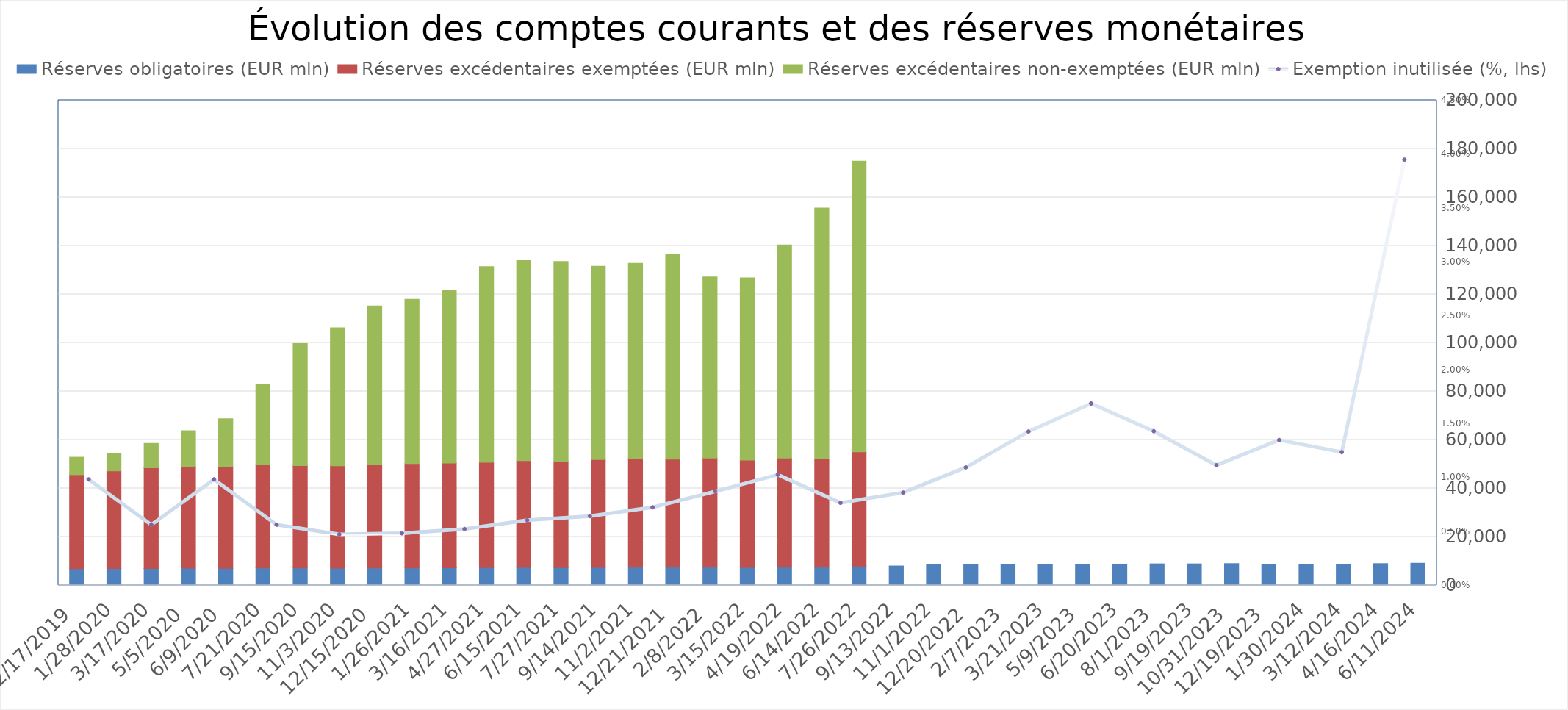
| Category | Réserves obligatoires (EUR mln) | Réserves excédentaires exemptées (EUR mln) | Réserves excédentaires non-exemptées (EUR mln) |
|---|---|---|---|
| 6/11/24 | 9161 | 0 | 0 |
| 4/16/24 | 8997 | 0 | 0 |
| 3/12/24 | 8722 | 0 | 0 |
| 1/30/24 | 8741.019 | 0 | 0 |
| 12/19/23 | 8762 | 0 | 0 |
| 10/31/23 | 9001 | 0 | 0 |
| 9/19/23 | 8896 | 0 | 0 |
| 8/1/23 | 8904 | 0 | 0 |
| 6/20/23 | 8799 | 0 | 0 |
| 5/9/23 | 8796 | 0 | 0 |
| 3/21/23 | 8668 | 0 | 0 |
| 2/7/23 | 8736 | 0 | 0 |
| 12/20/22 | 8689 | 0 | 0 |
| 11/1/22 | 8517 | 0 | 0 |
| 9/13/22 | 8018 | 0 | 0 |
| 7/26/22 | 7929 | 47109 | 119909 |
| 6/14/22 | 7495 | 44621 | 103454 |
| 4/19/22 | 7536 | 44962 | 87885 |
| 3/15/22 | 7409 | 44244 | 75192 |
| 2/8/22 | 7536 | 44997 | 74696 |
| 12/21/21 | 7472 | 44599 | 84381 |
| 11/2/21 | 7531 | 44914 | 80355 |
| 9/14/21 | 7460 | 44471 | 79647 |
| 7/27/21 | 7352 | 43793 | 82435 |
| 6/15/21 | 7404 | 44036 | 82520 |
| 4/27/21 | 7313 | 43430 | 80697 |
| 3/16/21 | 7254 | 43192 | 71224 |
| 1/26/21 | 7225 | 42978 | 67723 |
| 12/15/20 | 7190 | 42671 | 65344 |
| 11/3/20 | 7128 | 42161 | 56951 |
| 9/15/20 | 7165 | 42265 | 50289 |
| 7/21/20 | 7217 | 42685 | 33099 |
| 6/9/20 | 7060 | 41891 | 19741 |
| 5/5/20 | 7085 | 41937 | 14783 |
| 3/17/20 | 7002 | 41491 | 10061 |
| 1/28/20 | 6981 | 40234 | 7303 |
| 12/17/19 | 6887 | 38752 | 7220 |